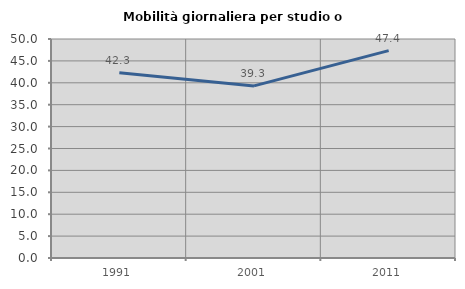
| Category | Mobilità giornaliera per studio o lavoro |
|---|---|
| 1991.0 | 42.294 |
| 2001.0 | 39.295 |
| 2011.0 | 47.351 |